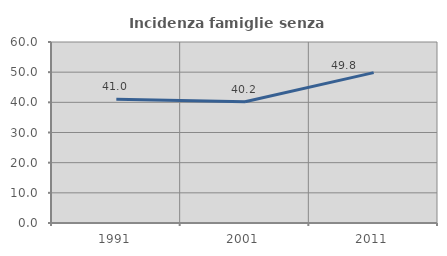
| Category | Incidenza famiglie senza nuclei |
|---|---|
| 1991.0 | 40.981 |
| 2001.0 | 40.188 |
| 2011.0 | 49.848 |